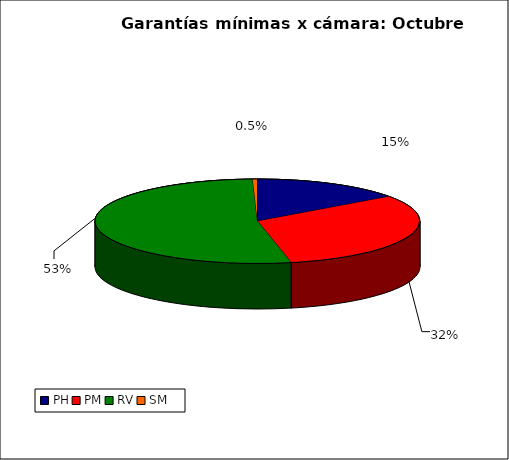
| Category | Series 0 |
|---|---|
| PH | 2012.211 |
| PM | 4228.2 |
| RV | 7062.291 |
| SM | 63.325 |